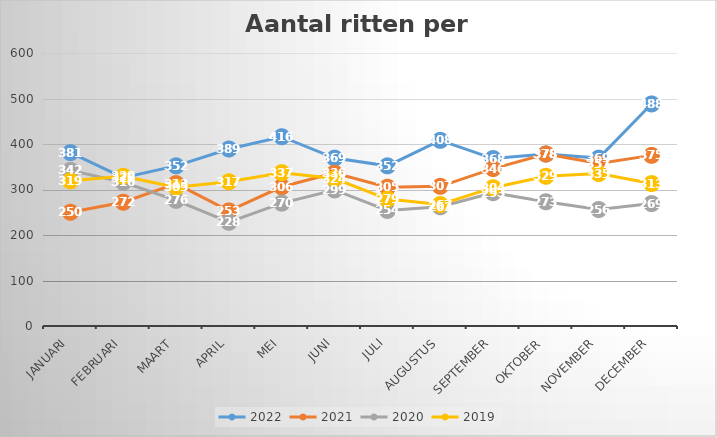
| Category | 2022 | 2021 | 2020 | 2019 |
|---|---|---|---|---|
| januari | 381 | 250 | 342 | 319 |
| februari | 326 | 272 | 316 | 329 |
| maart | 352 | 313 | 276 | 305 |
| april | 389 | 253 | 228 | 317 |
| mei | 416 | 306 | 270 | 337 |
| juni | 369 | 336 | 299 | 324 |
| juli | 352 | 305 | 254 | 279 |
| augustus | 408 | 307 | 262 | 267 |
| september | 368 | 346 | 293 | 304 |
| oktober | 378 | 378 | 273 | 329 |
| november | 369 | 357 | 256 | 335 |
| december | 488 | 375 | 269 | 313 |